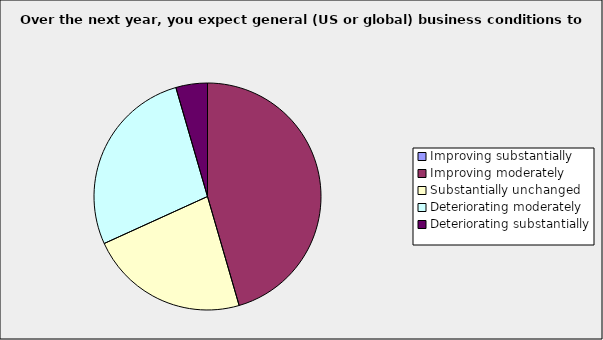
| Category | Series 0 |
|---|---|
| Improving substantially | 0 |
| Improving moderately | 0.455 |
| Substantially unchanged | 0.227 |
| Deteriorating moderately | 0.273 |
| Deteriorating substantially | 0.045 |